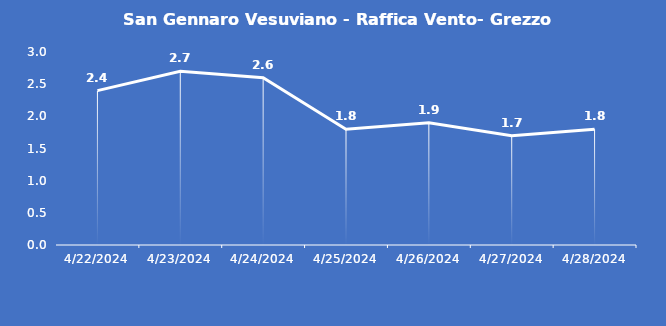
| Category | San Gennaro Vesuviano - Raffica Vento- Grezzo (m/s) |
|---|---|
| 4/22/24 | 2.4 |
| 4/23/24 | 2.7 |
| 4/24/24 | 2.6 |
| 4/25/24 | 1.8 |
| 4/26/24 | 1.9 |
| 4/27/24 | 1.7 |
| 4/28/24 | 1.8 |